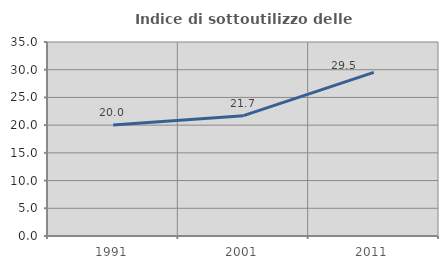
| Category | Indice di sottoutilizzo delle abitazioni  |
|---|---|
| 1991.0 | 20.022 |
| 2001.0 | 21.707 |
| 2011.0 | 29.528 |